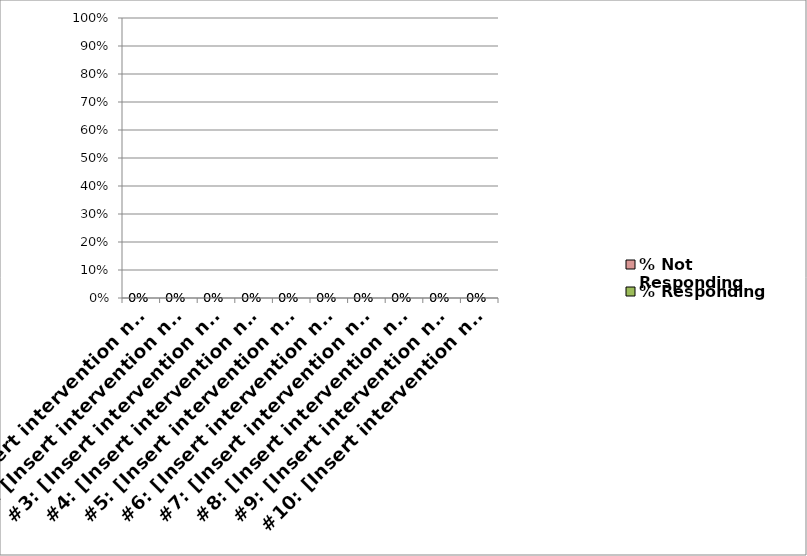
| Category | % Responding | % Not Responding |
|---|---|---|
| #1: [Insert intervention name] | 0 | 0 |
| #2: [Insert intervention name] | 0 | 0 |
| #3: [Insert intervention name] | 0 | 0 |
| #4: [Insert intervention name] | 0 | 0 |
| #5: [Insert intervention name] | 0 | 0 |
| #6: [Insert intervention name] | 0 | 0 |
| #7: [Insert intervention name] | 0 | 0 |
| #8: [Insert intervention name] | 0 | 0 |
| #9: [Insert intervention name] | 0 | 0 |
| #10: [Insert intervention name] | 0 | 0 |